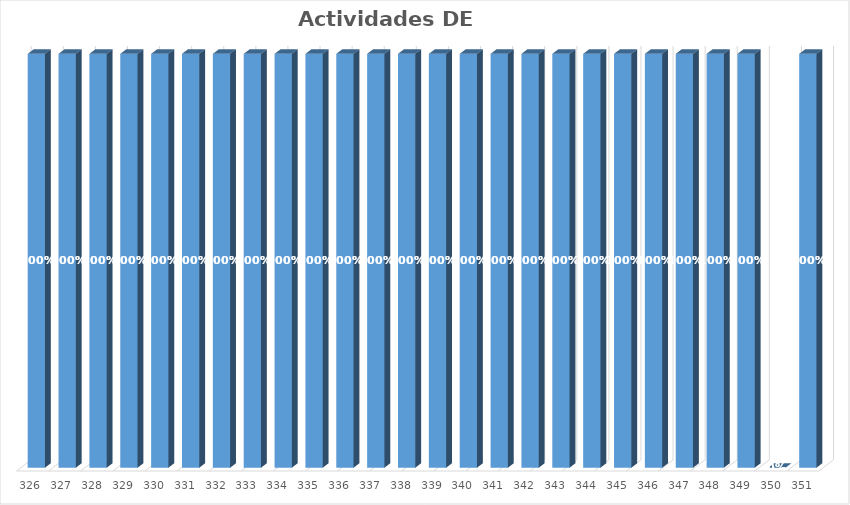
| Category | % Avance |
|---|---|
| 326.0 | 1 |
| 327.0 | 1 |
| 328.0 | 1 |
| 329.0 | 1 |
| 330.0 | 1 |
| 331.0 | 1 |
| 332.0 | 1 |
| 333.0 | 1 |
| 334.0 | 1 |
| 335.0 | 1 |
| 336.0 | 1 |
| 337.0 | 1 |
| 338.0 | 1 |
| 339.0 | 1 |
| 340.0 | 1 |
| 341.0 | 1 |
| 342.0 | 1 |
| 343.0 | 1 |
| 344.0 | 1 |
| 345.0 | 1 |
| 346.0 | 1 |
| 347.0 | 1 |
| 348.0 | 1 |
| 349.0 | 1 |
| 350.0 | 0 |
| 351.0 | 1 |